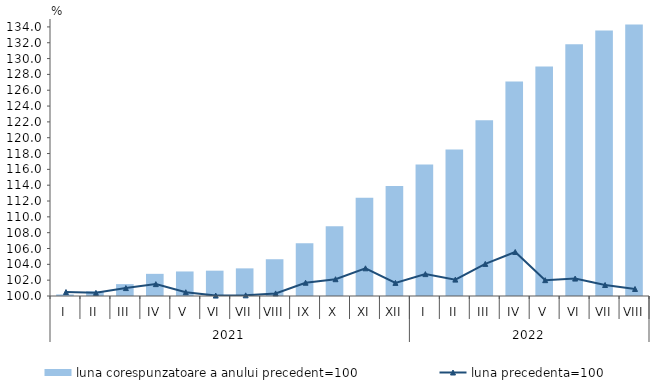
| Category | luna corespunzatoare a anului precedent=100 |
|---|---|
| 0 | 100.2 |
| 1 | 100.6 |
| 2 | 101.5 |
| 3 | 102.8 |
| 4 | 103.1 |
| 5 | 103.2 |
| 6 | 103.49 |
| 7 | 104.645 |
| 8 | 106.675 |
| 9 | 108.8 |
| 10 | 112.4 |
| 11 | 113.9 |
| 12 | 116.6 |
| 13 | 118.5 |
| 14 | 122.2 |
| 15 | 127.1 |
| 16 | 129 |
| 17 | 131.8 |
| 18 | 133.547 |
| 19 | 134.29 |